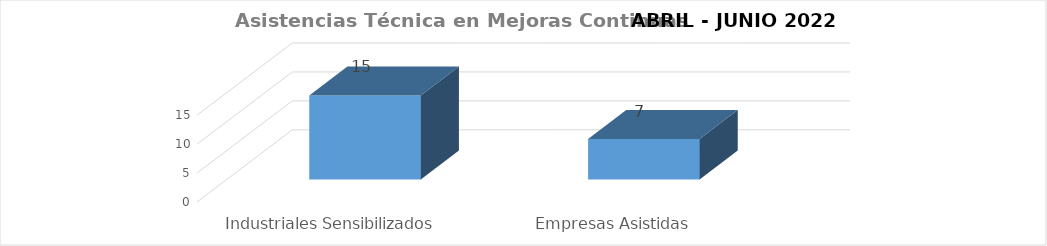
| Category | Series 0 |
|---|---|
| Industriales Sensibilizados  | 14.5 |
| Empresas Asistidas | 7 |